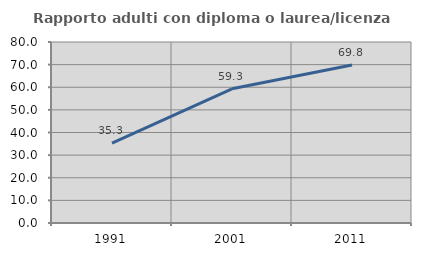
| Category | Rapporto adulti con diploma o laurea/licenza media  |
|---|---|
| 1991.0 | 35.308 |
| 2001.0 | 59.295 |
| 2011.0 | 69.796 |